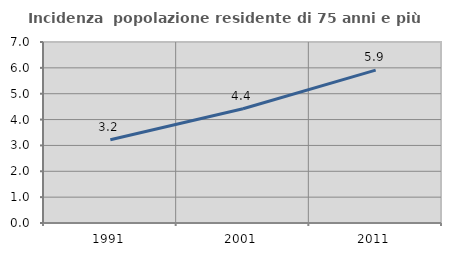
| Category | Incidenza  popolazione residente di 75 anni e più |
|---|---|
| 1991.0 | 3.222 |
| 2001.0 | 4.418 |
| 2011.0 | 5.912 |